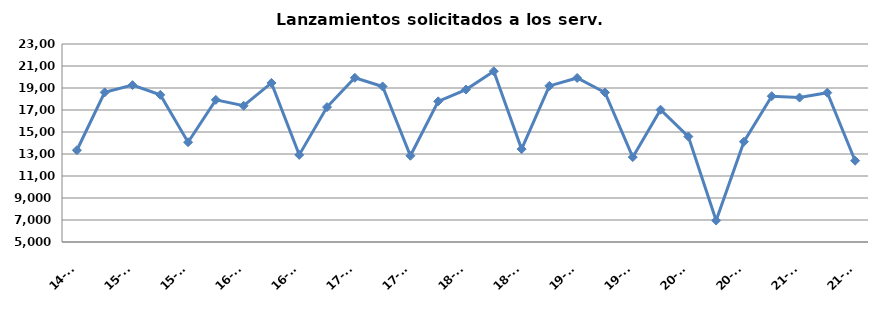
| Category | Lanzamientos solicitados a los Serv. comunes |
|---|---|
| 14-T3 | 13342 |
| 14-T4 | 18603 |
| 15-T1 | 19261 |
| 15-T2 | 18378 |
| 15-T3 | 14071 |
| 15-T4 | 17921 |
| 16-T1 | 17386 |
| 16-T2 | 19461 |
| 16-T3 | 12918 |
| 16-T4 | 17265 |
| 17-T1 | 19926 |
| 17-T2 | 19141 |
| 17-T3 | 12840 |
| 17-T4 | 17786 |
| 18-T1 | 18859 |
| 18-T2 | 20526 |
| 18-T3 | 13446 |
| 18-T4 | 19192 |
| 19-T1 | 19913 |
| 19-T2 | 18594 |
| 19-T3 | 12715 |
| 19-T4 | 17025 |
| 20-T1 | 14586 |
| 20-T2 | 6953 |
| 20-T3 | 14117 |
| 20-T4 | 18255 |
| 21-T1 | 18131 |
| 21-T2 | 18574 |
| 21-T3 | 12390 |